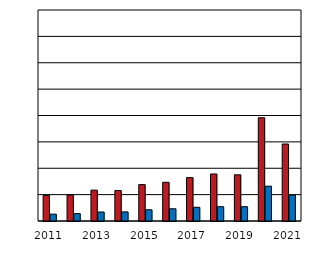
| Category | ženy  Women | muži  
Men |
|---|---|---|
| 2011.0 | 19.4 | 5.2 |
| 2012.0 | 19.7 | 5.6 |
| 2013.0 | 23.4 | 6.8 |
| 2014.0 | 23.1 | 6.9 |
| 2015.0 | 27.6 | 8.5 |
| 2016.0 | 29.356 | 9.267 |
| 2017.0 | 32.91 | 10.39 |
| 2018.0 | 35.642 | 10.846 |
| 2019.0 | 35.031 | 10.855 |
| 2020.0 | 78.3 | 26.4 |
| 2021.0 | 58.4 | 19.7 |